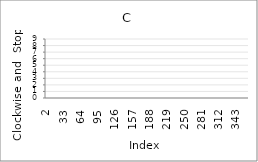
| Category | Series 0 |
|---|---|
| 2.0 | 8 |
| 3.0 | 9 |
| 4.0 | 3 |
| 5.0 | 1 |
| 6.0 | 8 |
| 7.0 | 2 |
| 8.0 | 6 |
| 9.0 | 0 |
| 10.0 | 2 |
| 11.0 | 0 |
| 12.0 | 4 |
| 13.0 | 0 |
| 14.0 | 4 |
| 15.0 | 3 |
| 16.0 | 5 |
| 17.0 | 3 |
| 18.0 | 6 |
| 19.0 | 7 |
| 20.0 | 1 |
| 21.0 | 4 |
| 22.0 | 0 |
| 23.0 | 0 |
| 24.0 | 4 |
| 25.0 | 8 |
| 26.0 | 7 |
| 27.0 | 1 |
| 28.0 | 8 |
| 29.0 | 7 |
| 30.0 | 8 |
| 31.0 | 99 |
| 32.0 | 99 |
| 33.0 | 99 |
| 34.0 | 99 |
| 35.0 | 99 |
| 36.0 | 99 |
| 37.0 | 99 |
| 38.0 | 99 |
| 39.0 | 99 |
| 40.0 | 99 |
| 41.0 | 99 |
| 42.0 | 99 |
| 43.0 | 99 |
| 44.0 | 99 |
| 45.0 | 99 |
| 46.0 | 99 |
| 47.0 | 99 |
| 48.0 | 99 |
| 49.0 | 99 |
| 50.0 | 99 |
| 51.0 | 99 |
| 52.0 | 99 |
| 53.0 | 99 |
| 54.0 | 99 |
| 55.0 | 99 |
| 56.0 | 99 |
| 57.0 | 99 |
| 58.0 | 99 |
| 59.0 | 99 |
| 60.0 | 99 |
| 61.0 | 99 |
| 62.0 | 99 |
| 63.0 | 99 |
| 64.0 | 99 |
| 65.0 | 99 |
| 66.0 | 99 |
| 67.0 | 99 |
| 68.0 | 99 |
| 69.0 | 99 |
| 70.0 | 99 |
| 71.0 | 99 |
| 72.0 | 99 |
| 73.0 | 99 |
| 74.0 | 99 |
| 75.0 | 99 |
| 76.0 | 99 |
| 77.0 | 99 |
| 78.0 | 99 |
| 79.0 | 99 |
| 80.0 | 99 |
| 81.0 | 99 |
| 82.0 | 99 |
| 83.0 | 99 |
| 84.0 | 99 |
| 85.0 | 99 |
| 86.0 | 99 |
| 87.0 | 99 |
| 88.0 | 99 |
| 89.0 | 99 |
| 90.0 | 99 |
| 91.0 | 99 |
| 92.0 | 99 |
| 93.0 | 99 |
| 94.0 | 99 |
| 95.0 | 99 |
| 96.0 | 99 |
| 97.0 | 99 |
| 98.0 | 99 |
| 99.0 | 99 |
| 100.0 | 99 |
| 101.0 | 99 |
| 102.0 | 99 |
| 103.0 | 99 |
| 104.0 | 99 |
| 105.0 | 99 |
| 106.0 | 99 |
| 107.0 | 99 |
| 108.0 | 99 |
| 109.0 | 99 |
| 110.0 | 99 |
| 111.0 | 99 |
| 112.0 | 99 |
| 113.0 | 99 |
| 114.0 | 99 |
| 115.0 | 99 |
| 116.0 | 99 |
| 117.0 | 99 |
| 118.0 | 99 |
| 119.0 | 99 |
| 120.0 | 99 |
| 121.0 | 99 |
| 122.0 | 99 |
| 123.0 | 99 |
| 124.0 | 99 |
| 125.0 | 99 |
| 126.0 | 99 |
| 127.0 | 99 |
| 128.0 | 99 |
| 129.0 | 99 |
| 130.0 | 99 |
| 131.0 | 99 |
| 132.0 | 99 |
| 133.0 | 99 |
| 134.0 | 99 |
| 135.0 | 99 |
| 136.0 | 99 |
| 137.0 | 99 |
| 138.0 | 99 |
| 139.0 | 99 |
| 140.0 | 99 |
| 141.0 | 99 |
| 142.0 | 99 |
| 143.0 | 99 |
| 144.0 | 99 |
| 145.0 | 99 |
| 146.0 | 99 |
| 147.0 | 99 |
| 148.0 | 99 |
| 149.0 | 99 |
| 150.0 | 99 |
| 151.0 | 99 |
| 152.0 | 99 |
| 153.0 | 99 |
| 154.0 | 99 |
| 155.0 | 99 |
| 156.0 | 99 |
| 157.0 | 99 |
| 158.0 | 99 |
| 159.0 | 99 |
| 160.0 | 99 |
| 161.0 | 99 |
| 162.0 | 99 |
| 163.0 | 99 |
| 164.0 | 99 |
| 165.0 | 99 |
| 166.0 | 99 |
| 167.0 | 99 |
| 168.0 | 99 |
| 169.0 | 99 |
| 170.0 | 99 |
| 171.0 | 99 |
| 172.0 | 99 |
| 173.0 | 99 |
| 174.0 | 99 |
| 175.0 | 99 |
| 176.0 | 99 |
| 177.0 | 99 |
| 178.0 | 99 |
| 179.0 | 99 |
| 180.0 | 99 |
| 181.0 | 99 |
| 182.0 | 99 |
| 183.0 | 99 |
| 184.0 | 99 |
| 185.0 | 99 |
| 186.0 | 99 |
| 187.0 | 99 |
| 188.0 | 99 |
| 189.0 | 99 |
| 190.0 | 99 |
| 191.0 | 99 |
| 192.0 | 99 |
| 193.0 | 99 |
| 194.0 | 99 |
| 195.0 | 99 |
| 196.0 | 99 |
| 197.0 | 99 |
| 198.0 | 99 |
| 199.0 | 99 |
| 200.0 | 99 |
| 201.0 | 99 |
| 202.0 | 99 |
| 203.0 | 99 |
| 204.0 | 99 |
| 205.0 | 99 |
| 206.0 | 99 |
| 207.0 | 99 |
| 208.0 | 99 |
| 209.0 | 99 |
| 210.0 | 99 |
| 211.0 | 99 |
| 212.0 | 99 |
| 213.0 | 99 |
| 214.0 | 99 |
| 215.0 | 99 |
| 216.0 | 99 |
| 217.0 | 99 |
| 218.0 | 99 |
| 219.0 | 99 |
| 220.0 | 99 |
| 221.0 | 99 |
| 222.0 | 99 |
| 223.0 | 99 |
| 224.0 | 99 |
| 225.0 | 99 |
| 226.0 | 99 |
| 227.0 | 99 |
| 228.0 | 99 |
| 229.0 | 99 |
| 230.0 | 99 |
| 231.0 | 99 |
| 232.0 | 99 |
| 233.0 | 99 |
| 234.0 | 99 |
| 235.0 | 99 |
| 236.0 | 99 |
| 237.0 | 99 |
| 238.0 | 99 |
| 239.0 | 99 |
| 240.0 | 99 |
| 241.0 | 99 |
| 242.0 | 99 |
| 243.0 | 99 |
| 244.0 | 99 |
| 245.0 | 99 |
| 246.0 | 99 |
| 247.0 | 99 |
| 248.0 | 99 |
| 249.0 | 99 |
| 250.0 | 99 |
| 251.0 | 99 |
| 252.0 | 99 |
| 253.0 | 99 |
| 254.0 | 99 |
| 255.0 | 99 |
| 256.0 | 99 |
| 257.0 | 99 |
| 258.0 | 99 |
| 259.0 | 99 |
| 260.0 | 99 |
| 261.0 | 99 |
| 262.0 | 99 |
| 263.0 | 99 |
| 264.0 | 99 |
| 265.0 | 99 |
| 266.0 | 99 |
| 267.0 | 99 |
| 268.0 | 99 |
| 269.0 | 99 |
| 270.0 | 99 |
| 271.0 | 99 |
| 272.0 | 99 |
| 273.0 | 99 |
| 274.0 | 99 |
| 275.0 | 99 |
| 276.0 | 99 |
| 277.0 | 99 |
| 278.0 | 99 |
| 279.0 | 99 |
| 280.0 | 99 |
| 281.0 | 99 |
| 282.0 | 99 |
| 283.0 | 99 |
| 284.0 | 99 |
| 285.0 | 99 |
| 286.0 | 99 |
| 287.0 | 99 |
| 288.0 | 99 |
| 289.0 | 99 |
| 290.0 | 99 |
| 291.0 | 99 |
| 292.0 | 99 |
| 293.0 | 99 |
| 294.0 | 99 |
| 295.0 | 99 |
| 296.0 | 99 |
| 297.0 | 99 |
| 298.0 | 99 |
| 299.0 | 99 |
| 300.0 | 99 |
| 301.0 | 99 |
| 302.0 | 99 |
| 303.0 | 99 |
| 304.0 | 99 |
| 305.0 | 99 |
| 306.0 | 99 |
| 307.0 | 99 |
| 308.0 | 99 |
| 309.0 | 99 |
| 310.0 | 99 |
| 311.0 | 99 |
| 312.0 | 99 |
| 313.0 | 99 |
| 314.0 | 99 |
| 315.0 | 99 |
| 316.0 | 99 |
| 317.0 | 99 |
| 318.0 | 99 |
| 319.0 | 99 |
| 320.0 | 99 |
| 321.0 | 99 |
| 322.0 | 99 |
| 323.0 | 99 |
| 324.0 | 99 |
| 325.0 | 99 |
| 326.0 | 99 |
| 327.0 | 99 |
| 328.0 | 99 |
| 329.0 | 99 |
| 330.0 | 99 |
| 331.0 | 99 |
| 332.0 | 99 |
| 333.0 | 99 |
| 334.0 | 99 |
| 335.0 | 99 |
| 336.0 | 99 |
| 337.0 | 99 |
| 338.0 | 99 |
| 339.0 | 99 |
| 340.0 | 99 |
| 341.0 | 99 |
| 342.0 | 99 |
| 343.0 | 99 |
| 344.0 | 99 |
| 345.0 | 99 |
| 346.0 | 99 |
| 347.0 | 99 |
| 348.0 | 99 |
| 349.0 | 99 |
| 350.0 | 99 |
| 351.0 | 99 |
| 352.0 | 99 |
| 353.0 | 99 |
| 354.0 | 99 |
| 355.0 | 99 |
| 356.0 | 99 |
| 357.0 | 99 |
| 358.0 | 99 |
| 359.0 | 99 |
| 360.0 | 99 |
| 361.0 | 99 |
| 362.0 | 99 |
| 363.0 | 99 |
| 364.0 | 99 |
| 365.0 | 99 |